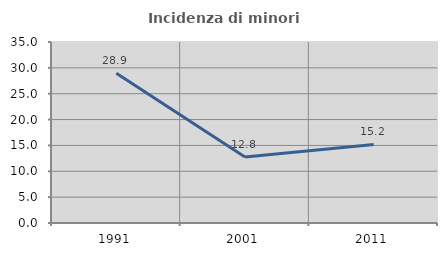
| Category | Incidenza di minori stranieri |
|---|---|
| 1991.0 | 28.947 |
| 2001.0 | 12.782 |
| 2011.0 | 15.198 |